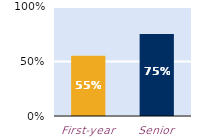
| Category | frequently |
|---|---|
| First-year | 0.552 |
| Senior | 0.752 |